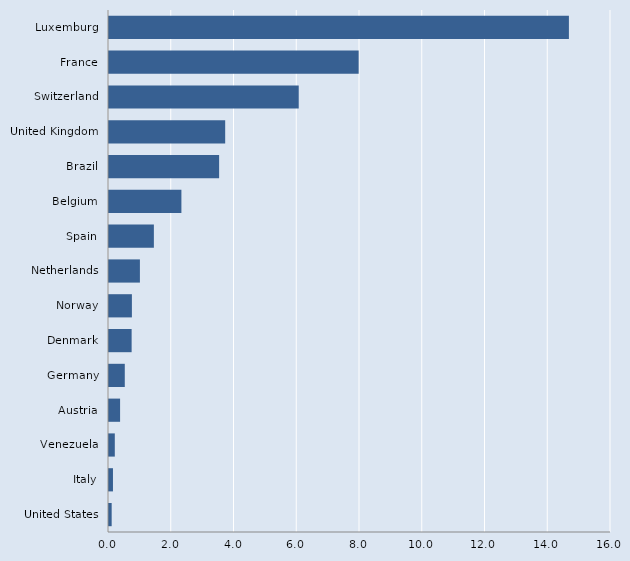
| Category | Series 0 |
|---|---|
| United States | 0.085 |
| Italy | 0.126 |
| Venezuela | 0.185 |
| Austria | 0.353 |
| Germany | 0.503 |
| Denmark | 0.721 |
| Norway | 0.73 |
| Netherlands | 0.985 |
| Spain | 1.43 |
| Belgium | 2.308 |
| Brazil | 3.51 |
| United Kingdom | 3.703 |
| Switzerland | 6.047 |
| France | 7.957 |
| Luxemburg | 14.658 |